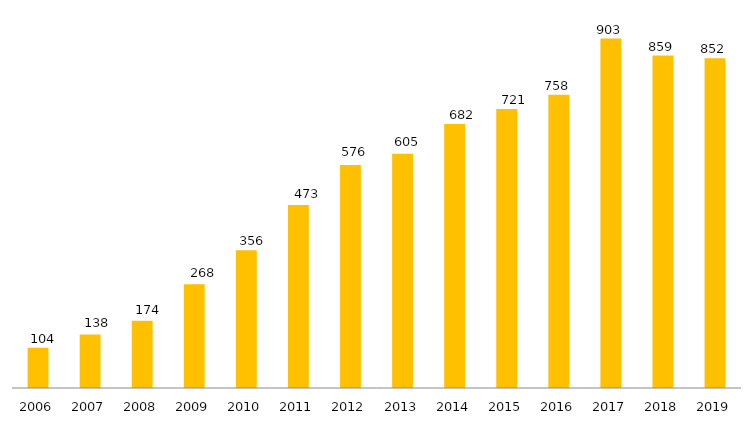
| Category | Programa |
|---|---|
| 2006.0 | 104 |
| 2007.0 | 138 |
| 2008.0 | 174 |
| 2009.0 | 268 |
| 2010.0 | 356 |
| 2011.0 | 473 |
| 2012.0 | 576 |
| 2013.0 | 605 |
| 2014.0 | 682 |
| 2015.0 | 721 |
| 2016.0 | 758 |
| 2017.0 | 903 |
| 2018.0 | 859 |
| 2019.0 | 852 |